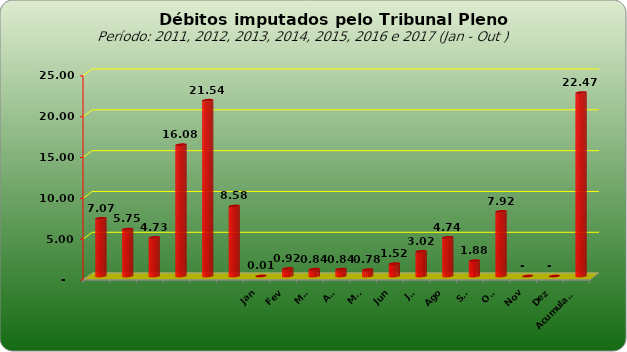
| Category |  7.073.154,74  |
|---|---|
|  | 7073154.74 |
|  | 5749129.25 |
|  | 4727033.51 |
|  | 16081820.48 |
|  | 21535723.6 |
|  | 8578266.09 |
| Jan | 7518 |
| Fev | 924330.96 |
| Mar | 840781.7 |
| Abr | 842058.28 |
| Mai | 780852.82 |
| Jun | 1521029.64 |
| Jul | 3021280.99 |
| Ago | 4735560.75 |
| Set | 1882202.79 |
| Out | 7918420.36 |
| Nov | 0 |
| Dez | 0 |
| Acumulado | 22474036.29 |